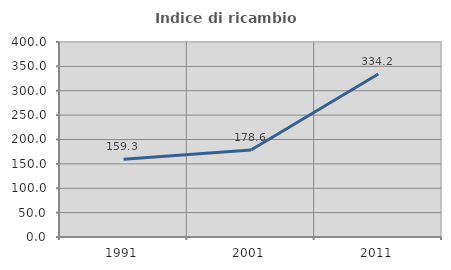
| Category | Indice di ricambio occupazionale  |
|---|---|
| 1991.0 | 159.259 |
| 2001.0 | 178.571 |
| 2011.0 | 334.211 |